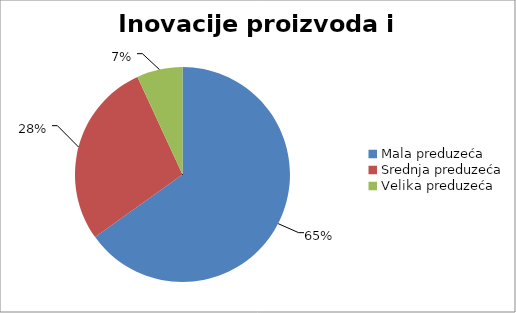
| Category | Inovacije proizvoda i procesa |
|---|---|
| Mala preduzeća | 558 |
| Srednja preduzeća | 240.001 |
| Velika preduzeća | 59 |